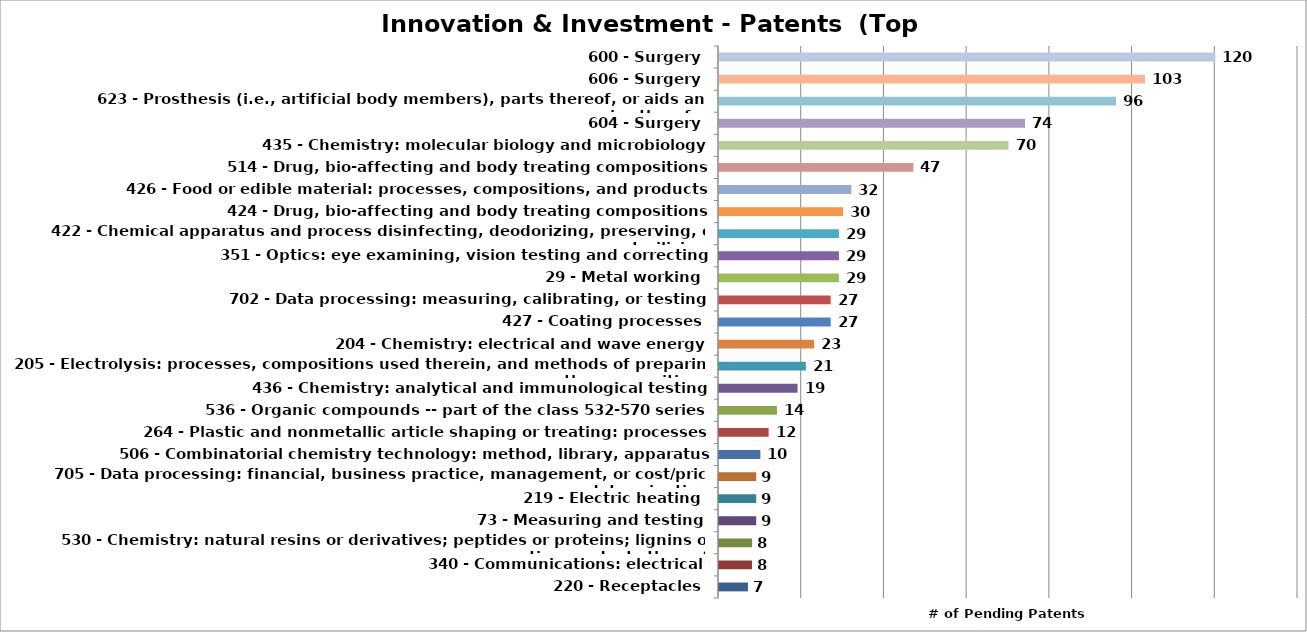
| Category | Series 0 |
|---|---|
| 220 - Receptacles | 7 |
| 340 - Communications: electrical | 8 |
| 530 - Chemistry: natural resins or derivatives; peptides or proteins; lignins or reaction products thereof | 8 |
| 73 - Measuring and testing | 9 |
| 219 - Electric heating | 9 |
| 705 - Data processing: financial, business practice, management, or cost/price determination | 9 |
| 506 - Combinatorial chemistry technology: method, library, apparatus | 10 |
| 264 - Plastic and nonmetallic article shaping or treating: processes | 12 |
| 536 - Organic compounds -- part of the class 532-570 series | 14 |
| 436 - Chemistry: analytical and immunological testing | 19 |
| 205 - Electrolysis: processes, compositions used therein, and methods of preparing the compositions | 21 |
| 204 - Chemistry: electrical and wave energy | 23 |
| 427 - Coating processes | 27 |
| 702 - Data processing: measuring, calibrating, or testing | 27 |
| 29 - Metal working | 29 |
| 351 - Optics: eye examining, vision testing and correcting | 29 |
| 422 - Chemical apparatus and process disinfecting, deodorizing, preserving, or sterilizing | 29 |
| 424 - Drug, bio-affecting and body treating compositions | 30 |
| 426 - Food or edible material: processes, compositions, and products | 32 |
| 514 - Drug, bio-affecting and body treating compositions | 47 |
| 435 - Chemistry: molecular biology and microbiology | 70 |
| 604 - Surgery | 74 |
| 623 - Prosthesis (i.e., artificial body members), parts thereof, or aids and accessories therefor | 96 |
| 606 - Surgery | 103 |
| 600 - Surgery | 120 |